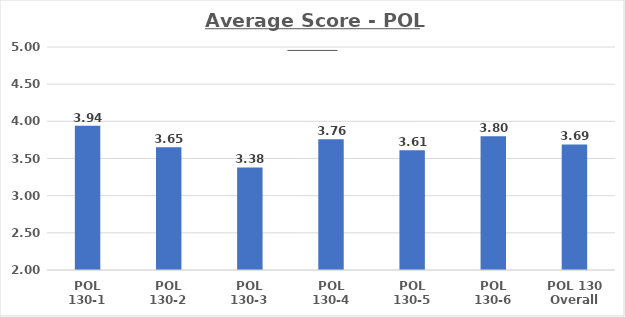
| Category | Average Score - POL 130s |
|---|---|
| POL 130-1 | 3.94 |
| POL 130-2 | 3.65 |
| POL 130-3 | 3.38 |
| POL 130-4 | 3.76 |
| POL 130-5 | 3.61 |
| POL 130-6 | 3.8 |
| POL 130 Overall | 3.69 |